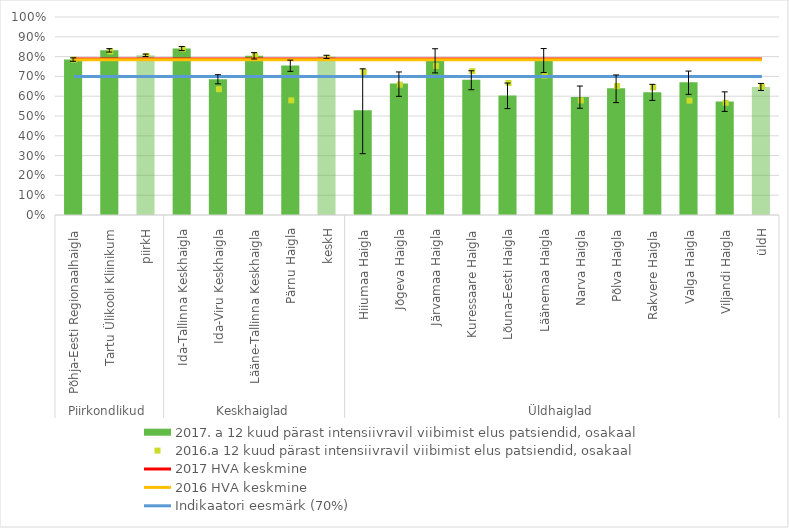
| Category | 2017. a 12 kuud pärast intensiivravil viibimist elus patsiendid, osakaal |
|---|---|
| 0 | 0.785 |
| 1 | 0.832 |
| 2 | 0.807 |
| 3 | 0.841 |
| 4 | 0.686 |
| 5 | 0.804 |
| 6 | 0.755 |
| 7 | 0.799 |
| 8 | 0.529 |
| 9 | 0.664 |
| 10 | 0.785 |
| 11 | 0.682 |
| 12 | 0.604 |
| 13 | 0.786 |
| 14 | 0.597 |
| 15 | 0.64 |
| 16 | 0.62 |
| 17 | 0.671 |
| 18 | 0.573 |
| 19 | 0.647 |